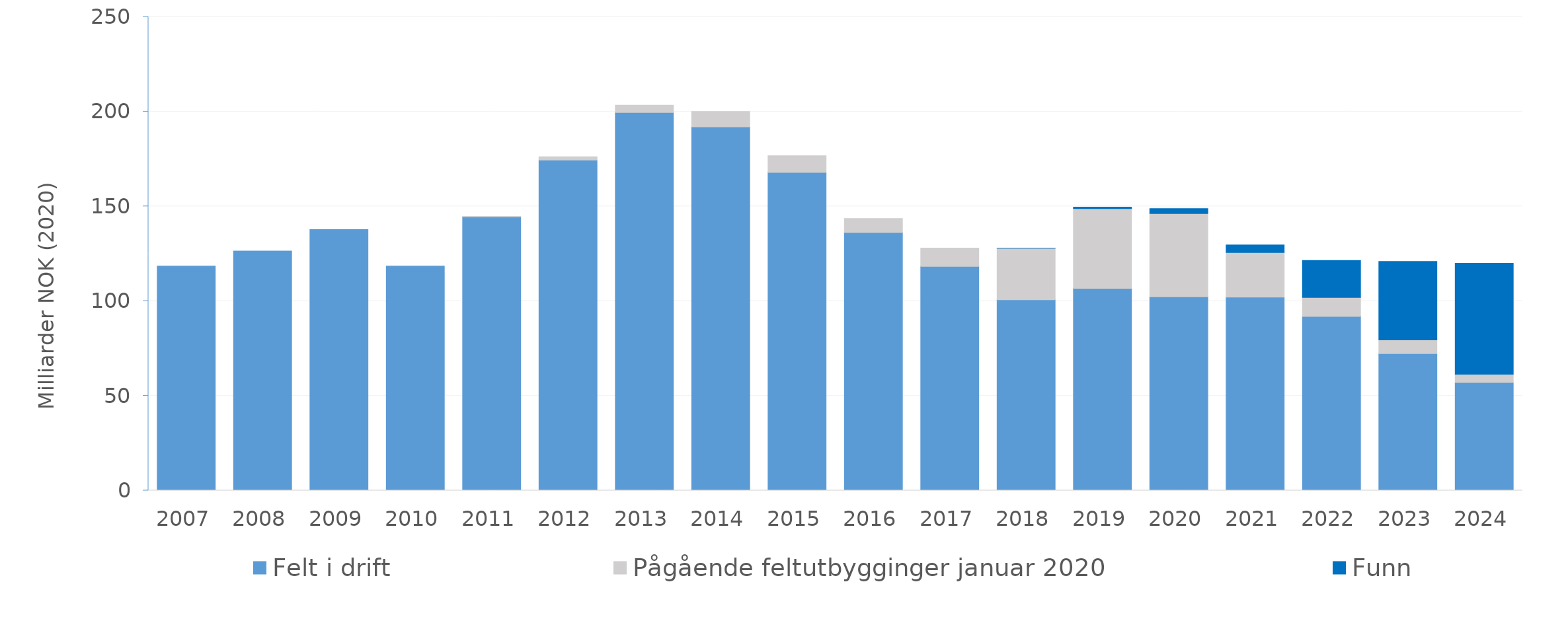
| Category | Felt i drift | Pågående feltutbygginger januar 2020 | Funn |
|---|---|---|---|
| 2007.0 | 118.456 | 0 | 0 |
| 2008.0 | 126.372 | 0 | 0 |
| 2009.0 | 137.763 | 0 | 0 |
| 2010.0 | 118.437 | 0 | 0 |
| 2011.0 | 144.396 | 0.249 | 0 |
| 2012.0 | 174.423 | 1.758 | 0 |
| 2013.0 | 199.537 | 3.843 | 0 |
| 2014.0 | 191.937 | 8.083 | 0 |
| 2015.0 | 167.904 | 8.786 | 0 |
| 2016.0 | 136.137 | 7.415 | 0 |
| 2017.0 | 118.293 | 9.695 | 0 |
| 2018.0 | 100.705 | 27.201 | 0.011 |
| 2019.0 | 106.681 | 42.085 | 0.776 |
| 2020.0 | 102.231 | 43.97 | 2.615 |
| 2021.0 | 102.069 | 23.579 | 3.93 |
| 2022.0 | 91.899 | 10.032 | 19.53 |
| 2023.0 | 72.286 | 7.177 | 41.475 |
| 2024.0 | 57.031 | 4.374 | 58.577 |